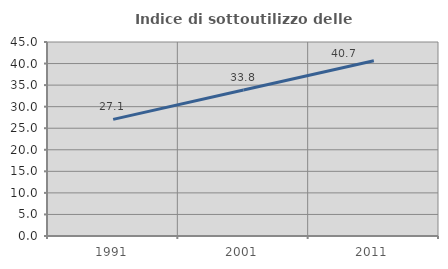
| Category | Indice di sottoutilizzo delle abitazioni  |
|---|---|
| 1991.0 | 27.059 |
| 2001.0 | 33.846 |
| 2011.0 | 40.657 |